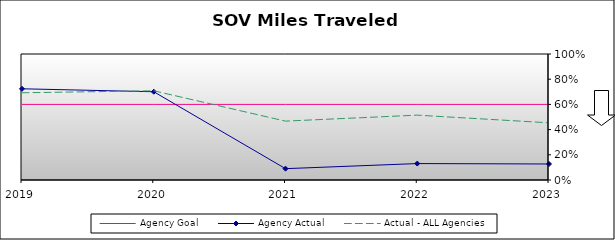
| Category | Agency Goal | Agency Actual | Actual - ALL Agencies |
|---|---|---|---|
| 2019.0 | 0.6 | 0.724 | 0.692 |
| 2020.0 | 0.6 | 0.7 | 0.708 |
| 2021.0 | 0.6 | 0.09 | 0.467 |
| 2022.0 | 0.6 | 0.13 | 0.515 |
| 2023.0 | 0.6 | 0.127 | 0.454 |